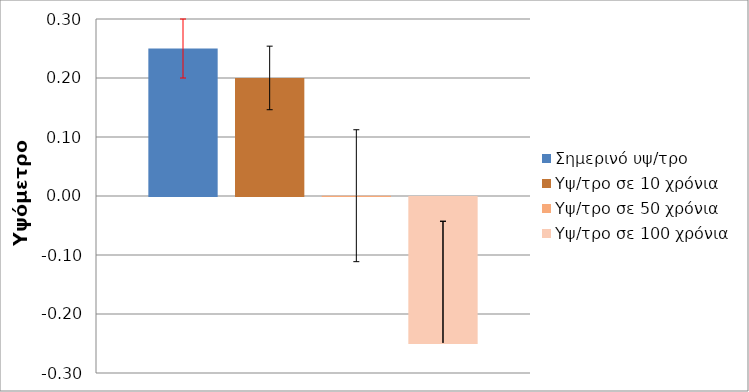
| Category | Σημερινό υψ/τρο | Υψ/τρο σε 10 χρόνια | Υψ/τρο σε 50 χρόνια | Υψ/τρο σε 100 χρόνια |
|---|---|---|---|---|
| Αβεβαιότητα | 0.25 | 0.2 | 0.001 | -0.249 |